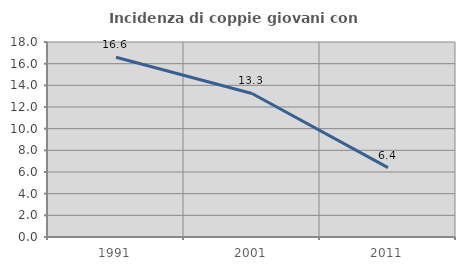
| Category | Incidenza di coppie giovani con figli |
|---|---|
| 1991.0 | 16.596 |
| 2001.0 | 13.251 |
| 2011.0 | 6.406 |